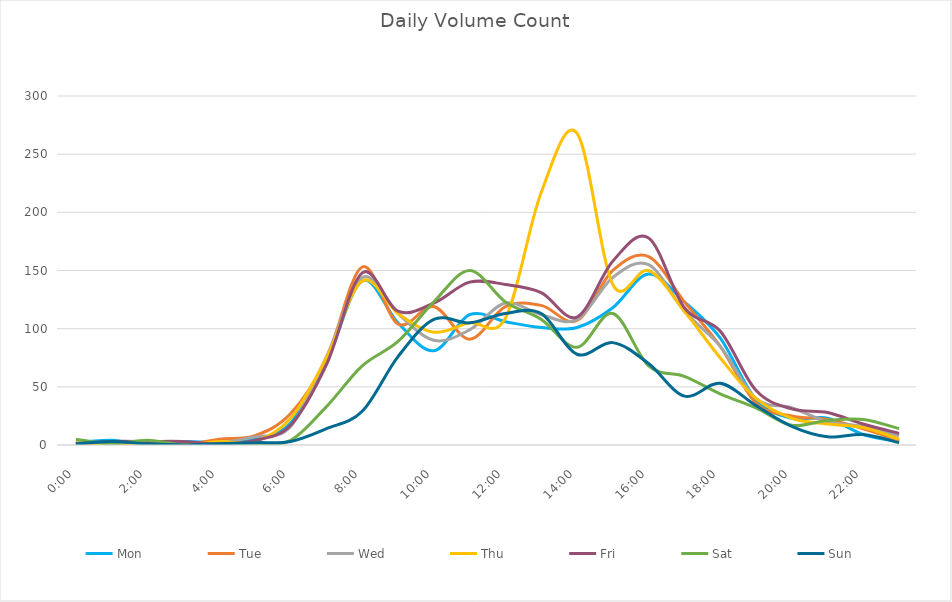
| Category | Mon | Tue | Wed | Thu | Fri | Sat | Sun |
|---|---|---|---|---|---|---|---|
| 0.0 | 2 | 1 | 2 | 2 | 1 | 5 | 1 |
| 0.0416666666666667 | 4 | 0 | 2 | 1 | 3 | 1 | 3 |
| 0.0833333333333333 | 0 | 1 | 1 | 1 | 3 | 4 | 1 |
| 0.125 | 3 | 0 | 1 | 0 | 3 | 0 | 0 |
| 0.166666666666667 | 2 | 5 | 2 | 3 | 1 | 0 | 1 |
| 0.208333333333333 | 5 | 8 | 7 | 3 | 4 | 1 | 2 |
| 0.25 | 19 | 27 | 16 | 23 | 17 | 4 | 3 |
| 0.291666666666667 | 72 | 74 | 76 | 75 | 69 | 33 | 14 |
| 0.333333333333333 | 141 | 153 | 144 | 141 | 148 | 68 | 29 |
| 0.375 | 105 | 104 | 113 | 113 | 115 | 89 | 76 |
| 0.416666666666667 | 81 | 119 | 90 | 97 | 122 | 123 | 108 |
| 0.4583333333333333 | 112 | 91 | 99 | 105 | 140 | 150 | 105 |
| 0.5 | 106 | 119 | 122 | 109 | 138 | 123 | 113 |
| 0.541666666666667 | 101 | 120 | 112 | 217 | 131 | 108 | 113 |
| 0.5833333333333334 | 101 | 107 | 108 | 268 | 110 | 84 | 78 |
| 0.625 | 118 | 150 | 144 | 138 | 158 | 113 | 88 |
| 0.666666666666667 | 147 | 162 | 155 | 150 | 178 | 68 | 70 |
| 0.7083333333333334 | 123 | 123 | 115 | 115 | 118 | 59 | 42 |
| 0.75 | 92 | 85 | 85 | 75 | 98 | 44 | 53 |
| 0.791666666666667 | 39 | 36 | 40 | 40 | 47 | 32 | 34 |
| 0.8333333333333334 | 23 | 25 | 32 | 23 | 31 | 17 | 16 |
| 0.875 | 23 | 22 | 20 | 18 | 28 | 21 | 7 |
| 0.916666666666667 | 9 | 14 | 16 | 15 | 18 | 22 | 9 |
| 0.9583333333333334 | 3 | 4 | 8 | 5 | 10 | 14 | 2 |